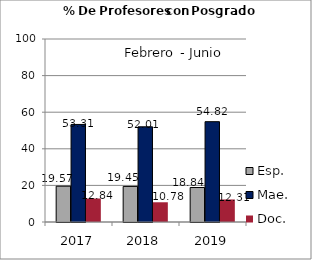
| Category | Esp. | Mae. | Doc. |
|---|---|---|---|
| 2017.0 | 19.57 | 53.31 | 12.84 |
| 2018.0 | 19.45 | 52.01 | 10.78 |
| 2019.0 | 18.84 | 54.82 | 12.31 |